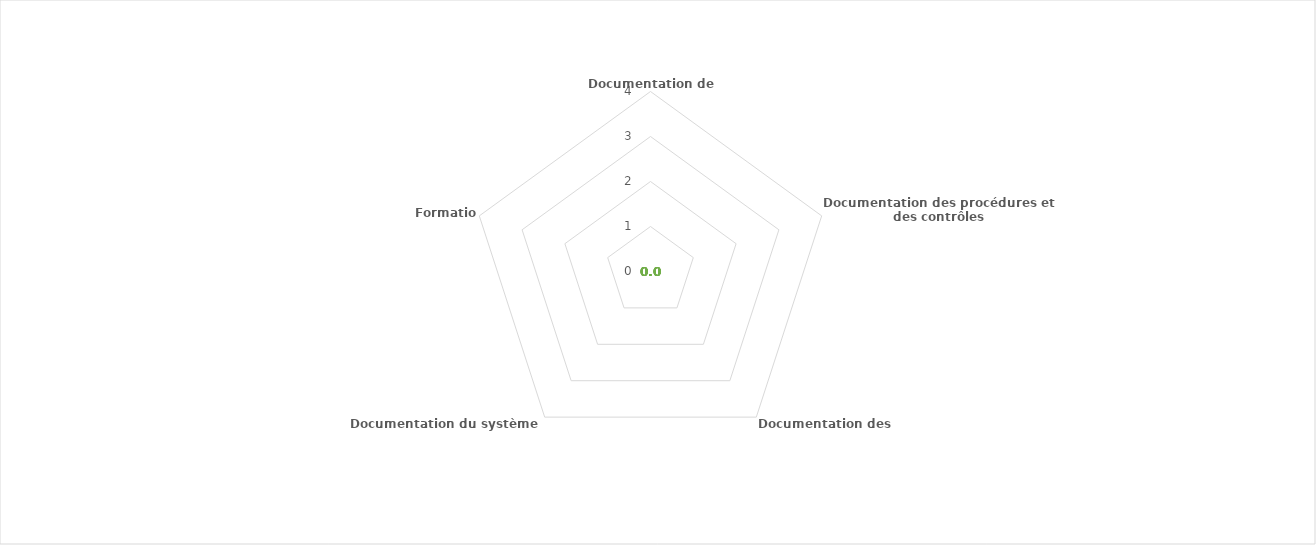
| Category | Series 0 |
|---|---|
| Documentation de l'organisation | 0 |
| Documentation des procédures et des contrôles | 0 |
| Documentation des risques | 0 |
| Documentation du système d'information | 0 |
| Formation | 0 |